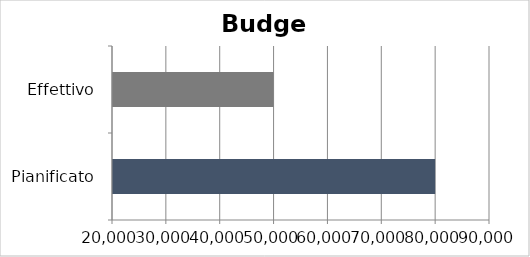
| Category | Series 0 |
|---|---|
| Pianificato | 80000 |
| Effettivo | 50000 |